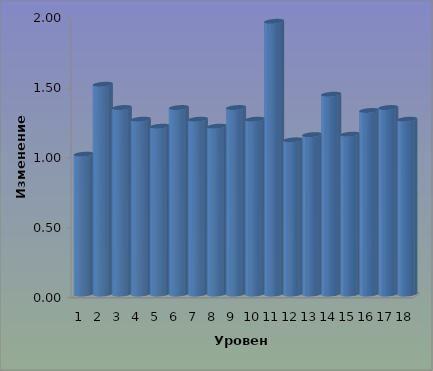
| Category | Series 0 |
|---|---|
| 0 | 1 |
| 1 | 1.5 |
| 2 | 1.333 |
| 3 | 1.25 |
| 4 | 1.2 |
| 5 | 1.333 |
| 6 | 1.25 |
| 7 | 1.2 |
| 8 | 1.333 |
| 9 | 1.25 |
| 10 | 1.95 |
| 11 | 1.103 |
| 12 | 1.14 |
| 13 | 1.429 |
| 14 | 1.143 |
| 15 | 1.312 |
| 16 | 1.333 |
| 17 | 1.25 |